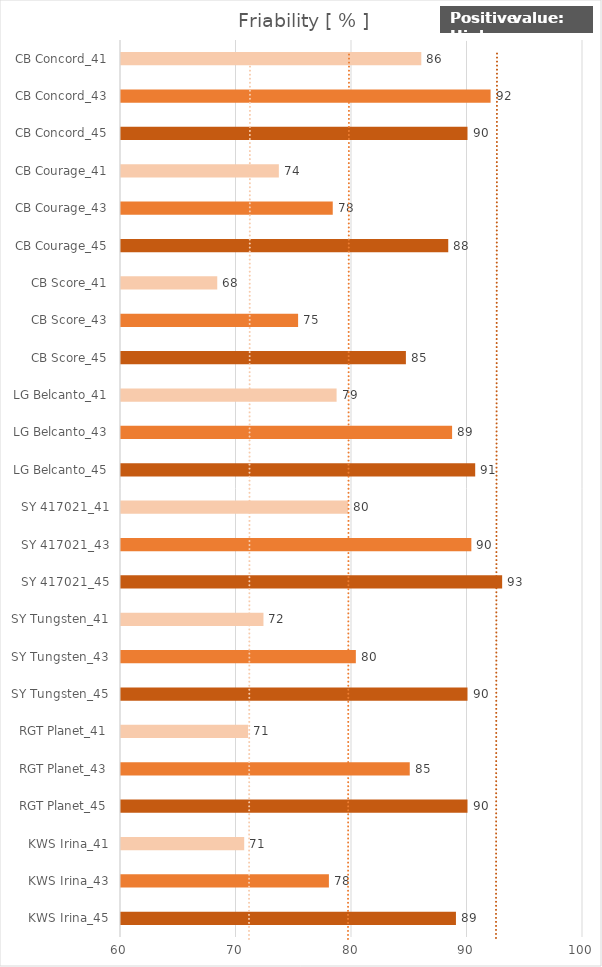
| Category |   Friability [ % ] |
|---|---|
| KWS Irina_45 | 89 |
| KWS Irina_43 | 78 |
| KWS Irina_41 | 70.667 |
| RGT Planet_45 | 90 |
| RGT Planet_43 | 85 |
| RGT Planet_41 | 71 |
| SY Tungsten_45 | 90 |
| SY Tungsten_43 | 80.333 |
| SY Tungsten_41 | 72.333 |
| SY 417021_45 | 93 |
| SY 417021_43 | 90.333 |
| SY 417021_41 | 79.667 |
| LG Belcanto_45 | 90.667 |
| LG Belcanto_43 | 88.667 |
| LG Belcanto_41 | 78.667 |
| CB Score_45 | 84.667 |
| CB Score_43 | 75.333 |
| CB Score_41 | 68.333 |
| CB Courage_45 | 88.333 |
| CB Courage_43 | 78.333 |
| CB Courage_41 | 73.667 |
| CB Concord_45 | 90 |
| CB Concord_43 | 92 |
| CB Concord_41 | 86 |